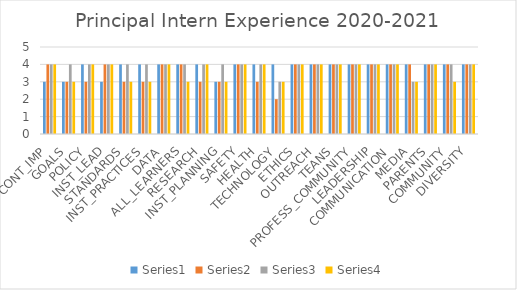
| Category | Series 0 | Series 1 | Series 2 | Series 3 |
|---|---|---|---|---|
| CONT_IMP | 3 | 4 | 4 | 4 |
| GOALS | 3 | 3 | 4 | 3 |
| POLICY | 4 | 3 | 4 | 4 |
| INST_LEAD | 3 | 4 | 4 | 4 |
| STANDARDS | 4 | 3 | 4 | 3 |
| INST_PRACTICES | 4 | 3 | 4 | 3 |
| DATA | 4 | 4 | 4 | 4 |
| ALL_LEARNERS | 4 | 4 | 4 | 3 |
| RESEARCH | 4 | 3 | 4 | 4 |
| INST_PLANNING | 3 | 3 | 4 | 3 |
| SAFETY | 4 | 4 | 4 | 4 |
| HEALTH | 4 | 3 | 4 | 4 |
| TECHNOLOGY | 4 | 2 | 3 | 3 |
| ETHICS | 4 | 4 | 4 | 4 |
| OUTREACH | 4 | 4 | 4 | 4 |
| TEANS | 4 | 4 | 4 | 4 |
| PROFESS_COMMUNITY | 4 | 4 | 4 | 4 |
| LEADERSHIP | 4 | 4 | 4 | 4 |
| COMMUNICATION | 4 | 4 | 4 | 4 |
| MEDIA | 4 | 4 | 3 | 3 |
| PARENTS | 4 | 4 | 4 | 4 |
| COMMUNITY | 4 | 4 | 4 | 3 |
| DIVERSITY | 4 | 4 | 4 | 4 |